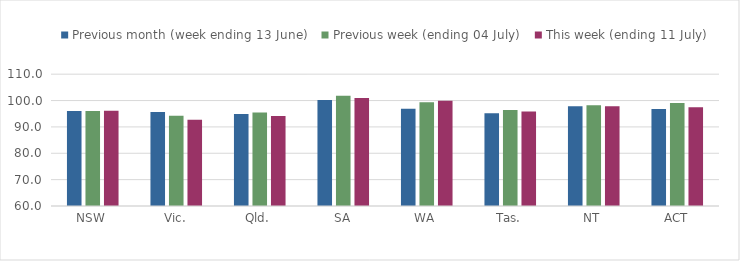
| Category | Previous month (week ending 13 June) | Previous week (ending 04 July) | This week (ending 11 July) |
|---|---|---|---|
| NSW | 96.008 | 96.078 | 96.11 |
| Vic. | 95.669 | 94.215 | 92.76 |
| Qld. | 94.916 | 95.458 | 94.103 |
| SA | 100.189 | 101.796 | 100.968 |
| WA | 96.913 | 99.337 | 99.952 |
| Tas. | 95.222 | 96.402 | 95.808 |
| NT | 97.833 | 98.194 | 97.846 |
| ACT | 96.804 | 99.025 | 97.415 |